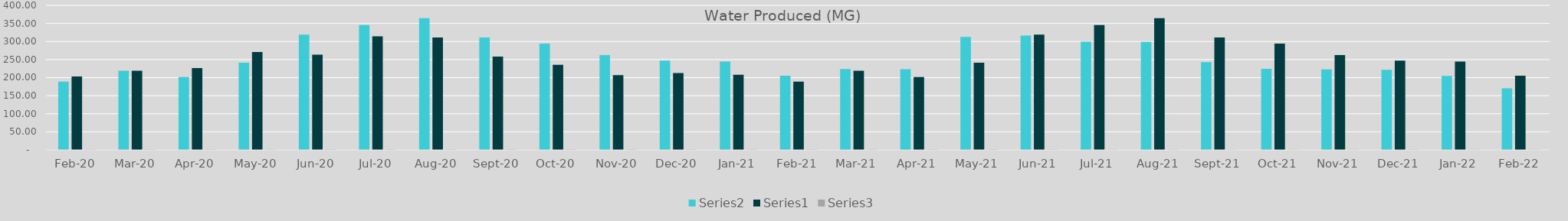
| Category | Series 1 | Series 0 | Series 2 |
|---|---|---|---|
| 2020-02-01 | 189.14 | 202.92 | 0.932 |
| 2020-03-01 | 218.9 | 218.89 | 1 |
| 2020-04-01 | 201.4 | 226.62 | 0.889 |
| 2020-05-01 | 241.3 | 270.85 | 0.891 |
| 2020-06-01 | 318.9 | 263.67 | 1.209 |
| 2020-07-01 | 345.4 | 314.55 | 1.098 |
| 2020-08-01 | 364.8 | 311.17 | 1.172 |
| 2020-09-01 | 311 | 258.3 | 1.204 |
| 2020-10-01 | 294.3 | 235.52 | 1.25 |
| 2020-11-01 | 262.21 | 207.02 | 1.267 |
| 2020-12-01 | 246.95 | 212.652 | 1.161 |
| 2021-01-01 | 244.698 | 208.082 | 1.176 |
| 2021-02-01 | 205.51 | 189.14 | 1.087 |
| 2021-03-01 | 223.92 | 218.9 | 1.023 |
| 2021-04-01 | 223.48 | 201.4 | 1.11 |
| 2021-05-01 | 312.74 | 241.3 | 1.296 |
| 2021-06-01 | 316.23 | 318.9 | 0.992 |
| 2021-07-01 | 299.67 | 345.4 | 0.868 |
| 2021-08-01 | 299.01 | 364.8 | 0.82 |
| 2021-09-01 | 242.761 | 311 | 0.781 |
| 2021-10-01 | 224.43 | 294.3 | 0.763 |
| 2021-11-01 | 222.799 | 262.21 | 0.85 |
| 2021-12-01 | 221.476 | 246.95 | 0.897 |
| 2022-01-01 | 204.928 | 244.698 | 0.837 |
| 2022-02-01 | 170.15 | 205.51 | 0.828 |